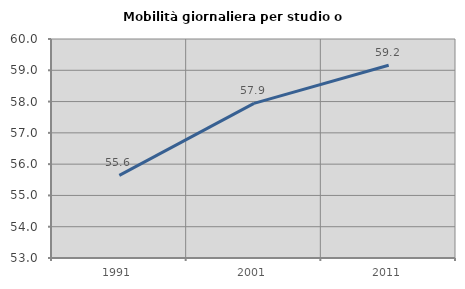
| Category | Mobilità giornaliera per studio o lavoro |
|---|---|
| 1991.0 | 55.643 |
| 2001.0 | 57.941 |
| 2011.0 | 59.159 |